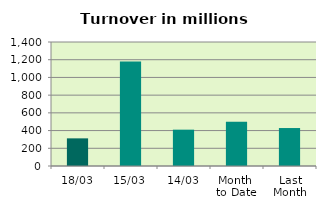
| Category | Series 0 |
|---|---|
| 18/03 | 312.099 |
| 15/03 | 1179.268 |
| 14/03 | 410.236 |
| Month 
to Date | 498.754 |
| Last
Month | 428.598 |